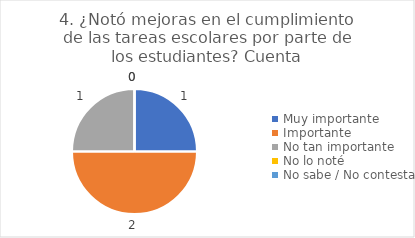
| Category | 4. ¿Notó mejoras en el cumplimiento de las tareas escolares por parte de los estudiantes? |
|---|---|
| Muy importante  | 0.25 |
| Importante  | 0.5 |
| No tan importante  | 0.25 |
| No lo noté  | 0 |
| No sabe / No contesta | 0 |